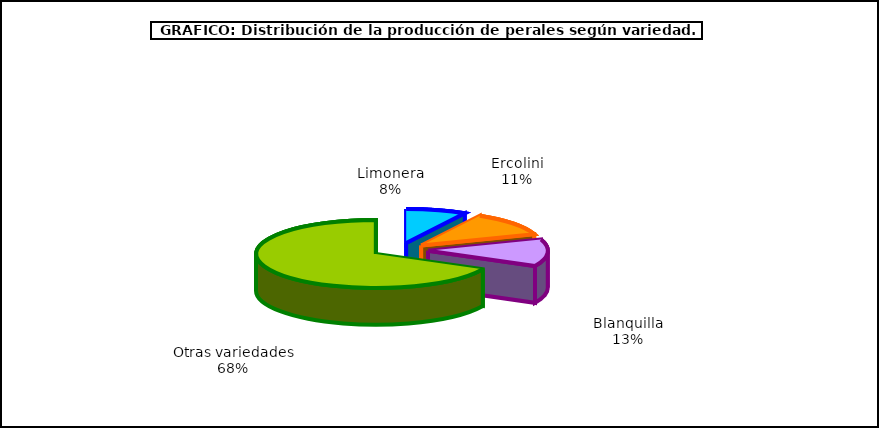
| Category | produccion |
|---|---|
| 0 | 29.352 |
| 1 | 41.39 |
| 2 | 46.319 |
| 3 | 243.896 |